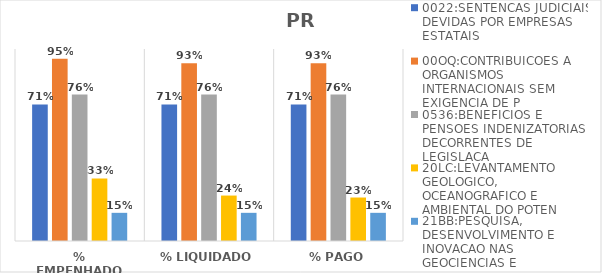
| Category | 0022:SENTENCAS JUDICIAIS DEVIDAS POR EMPRESAS ESTATAIS | 00OQ:CONTRIBUICOES A ORGANISMOS INTERNACIONAIS SEM EXIGENCIA DE P | 0536:BENEFICIOS E PENSOES INDENIZATORIAS DECORRENTES DE LEGISLACA | 20LC:LEVANTAMENTO GEOLOGICO, OCEANOGRAFICO E AMBIENTAL DO POTEN | 21BB:PESQUISA, DESENVOLVIMENTO E INOVACAO NAS GEOCIENCIAS E |
|---|---|---|---|---|---|
| % EMPENHADO | 0.711 | 0.95 | 0.763 | 0.326 | 0.147 |
| % LIQUIDADO | 0.711 | 0.926 | 0.763 | 0.237 | 0.147 |
| % PAGO | 0.711 | 0.926 | 0.763 | 0.226 | 0.147 |